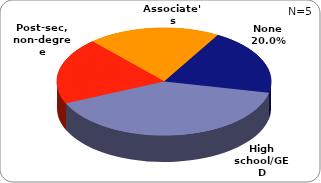
| Category | Series 0 |
|---|---|
| None | 0.2 |
| High school/GED | 0.4 |
| Post-sec, non-degree | 0.2 |
| Associate's | 0.2 |